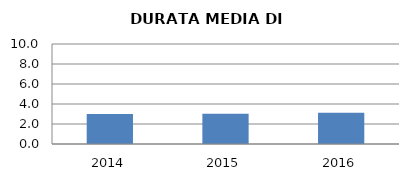
| Category | 2014 2015 2016 |
|---|---|
| 2014.0 | 3.011 |
| 2015.0 | 3.02 |
| 2016.0 | 3.113 |